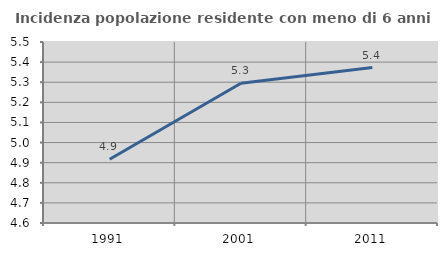
| Category | Incidenza popolazione residente con meno di 6 anni |
|---|---|
| 1991.0 | 4.917 |
| 2001.0 | 5.295 |
| 2011.0 | 5.373 |